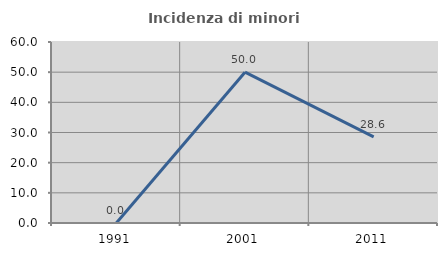
| Category | Incidenza di minori stranieri |
|---|---|
| 1991.0 | 0 |
| 2001.0 | 50 |
| 2011.0 | 28.571 |